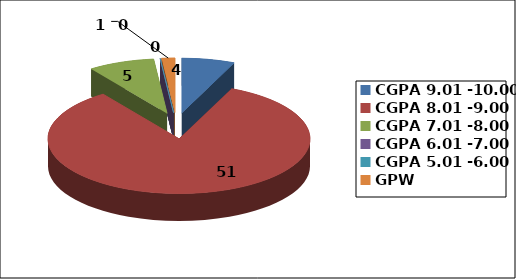
| Category | Series 0 |
|---|---|
| CGPA 9.01 -10.00 | 4 |
| CGPA 8.01 -9.00 | 51 |
| CGPA 7.01 -8.00 | 5 |
| CGPA 6.01 -7.00 | 0 |
| CGPA 5.01 -6.00 | 0 |
| GPW | 1 |